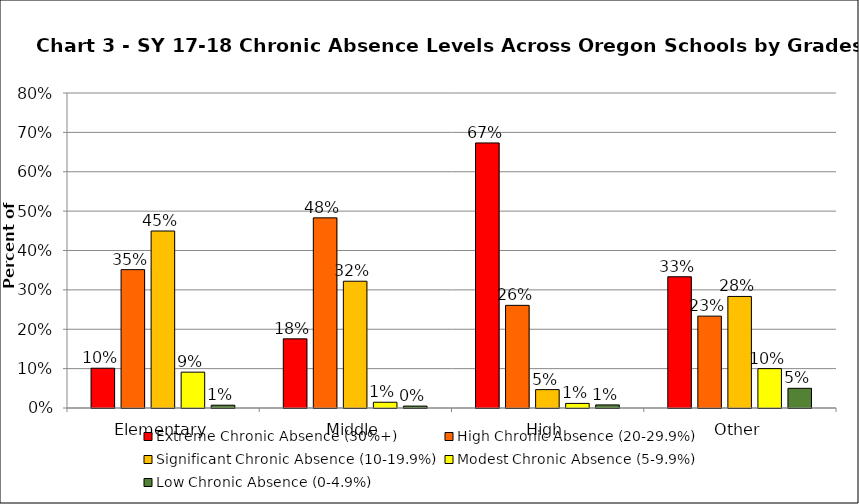
| Category | Extreme Chronic Absence (30%+) | High Chronic Absence (20-29.9%) | Significant Chronic Absence (10-19.9%) | Modest Chronic Absence (5-9.9%) | Low Chronic Absence (0-4.9%) |
|---|---|---|---|---|---|
| 0 | 0.101 | 0.351 | 0.45 | 0.091 | 0.007 |
| 1 | 0.176 | 0.483 | 0.322 | 0.015 | 0.005 |
| 2 | 0.673 | 0.261 | 0.047 | 0.012 | 0.008 |
| 3 | 0.333 | 0.233 | 0.283 | 0.1 | 0.05 |